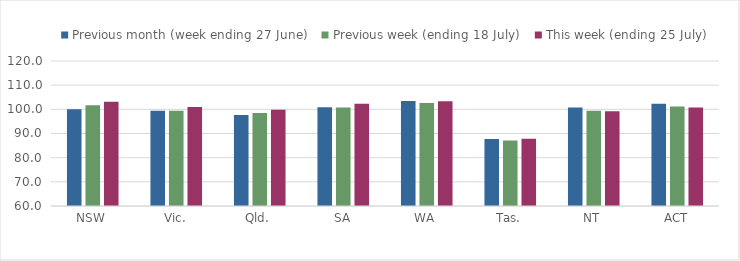
| Category | Previous month (week ending 27 June) | Previous week (ending 18 July) | This week (ending 25 July) |
|---|---|---|---|
| NSW | 100.007 | 101.729 | 103.183 |
| Vic. | 99.397 | 99.452 | 100.938 |
| Qld. | 97.7 | 98.437 | 99.879 |
| SA | 100.887 | 100.727 | 102.262 |
| WA | 103.419 | 102.623 | 103.322 |
| Tas. | 87.713 | 87.074 | 87.874 |
| NT | 100.739 | 99.445 | 99.172 |
| ACT | 102.361 | 101.211 | 100.726 |